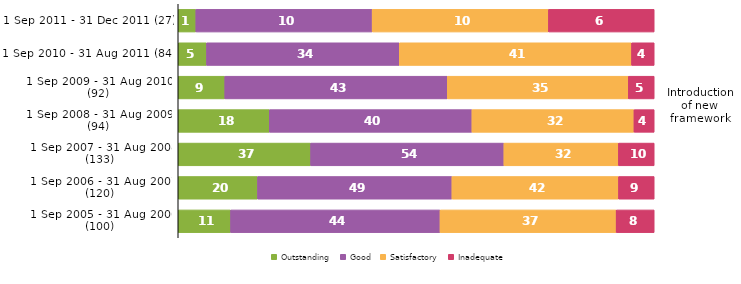
| Category | Outstanding | Good | Satisfactory | Inadequate |
|---|---|---|---|---|
| 1 Sep 2011 - 31 Dec 2011 (27) | 1 | 10 | 10 | 6 |
| 1 Sep 2010 - 31 Aug 2011 (84) | 5 | 34 | 41 | 4 |
| 1 Sep 2009 - 31 Aug 2010  (92) | 9 | 43 | 35 | 5 |
| 1 Sep 2008 - 31 Aug 2009  (94) | 18 | 40 | 32 | 4 |
| 1 Sep 2007 - 31 Aug 2008 (133) | 37 | 54 | 32 | 10 |
| 1 Sep 2006 - 31 Aug 2007 (120) | 20 | 49 | 42 | 9 |
| 1 Sep 2005 - 31 Aug 2006 (100) | 11 | 44 | 37 | 8 |